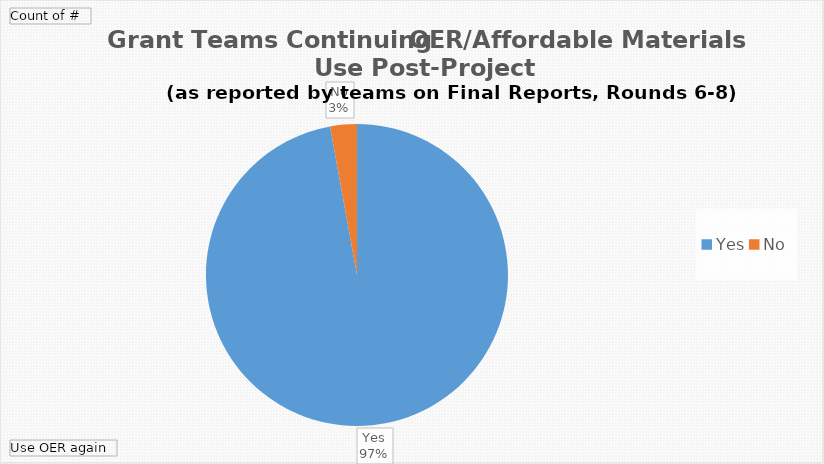
| Category | Total |
|---|---|
| Yes | 34 |
| No | 1 |